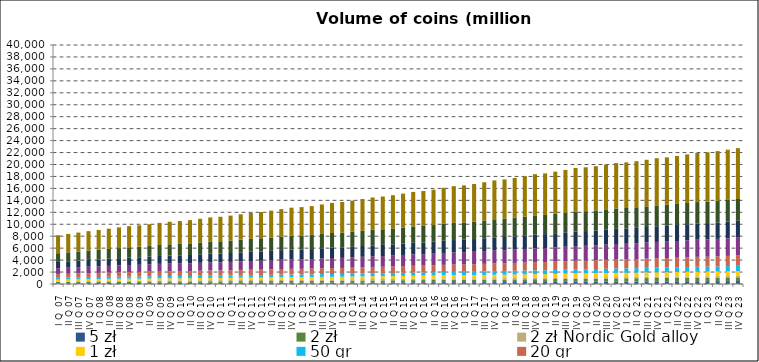
| Category | 5 zł | 2 zł | 2 zł Nordic Gold alloy | 1 zł | 50 gr | 20 gr | 10 gr | 5 gr | 2 gr | 1 gr |
|---|---|---|---|---|---|---|---|---|---|---|
| I Q  07 | 128.925 | 203.436 | 106.455 | 288.697 | 303.986 | 617.921 | 995.443 | 1054.495 | 1455.279 | 3008.076 |
| II Q 07 | 137.979 | 208.811 | 112.669 | 304.354 | 314.953 | 632.421 | 1017.821 | 1079.458 | 1491.694 | 3082.289 |
| III Q 07 | 144.925 | 218.512 | 117.189 | 314.387 | 327.785 | 644.381 | 1045.808 | 1106.071 | 1532.131 | 3157.015 |
| IV Q 07 | 152.966 | 222.148 | 124.747 | 320.172 | 334.976 | 668.63 | 1068.443 | 1138.454 | 1577.09 | 3233.525 |
| I Q 08 | 157.034 | 223.38 | 132.378 | 322.573 | 338.209 | 688.09 | 1090.962 | 1166.176 | 1619.841 | 3305.89 |
| II Q 08 | 162.349 | 231.933 | 137.587 | 333.21 | 342.406 | 707.859 | 1117.7 | 1197.903 | 1653.619 | 3374.339 |
| III Q 08 | 163.389 | 237.944 | 140.149 | 352.6 | 344.781 | 723.211 | 1146.852 | 1222.462 | 1679.878 | 3465.863 |
| IV Q 08 | 167.692 | 239.632 | 145.228 | 354.438 | 349.388 | 748.138 | 1170.047 | 1248.882 | 1724.192 | 3529.936 |
| I Q 09 | 173.376 | 238.946 | 148.941 | 345.802 | 354.387 | 760.651 | 1189.614 | 1266.928 | 1759.557 | 3580.576 |
| II Q 09 | 183.943 | 247.689 | 153.277 | 349.818 | 361.813 | 775.375 | 1211.241 | 1294.127 | 1793.901 | 3636.416 |
| III Q 09 | 193.254 | 255.113 | 159.526 | 352.836 | 371.531 | 795.289 | 1239.154 | 1325.485 | 1836.365 | 3700.936 |
| IV Q 09 | 193.912 | 253.541 | 165.782 | 351.473 | 372.198 | 806.961 | 1263.964 | 1358.406 | 1881.651 | 3769.924 |
| I Q 10 | 182.767 | 251.651 | 169.078 | 347.059 | 371.217 | 812.077 | 1281.063 | 1380.048 | 1915.753 | 3828.451 |
| II Q 10 | 185.525 | 256.719 | 173.377 | 351.98 | 374.793 | 821.085 | 1298.268 | 1398.335 | 1945.532 | 3884.836 |
| III Q 10 | 188.842 | 264.995 | 179.083 | 362.819 | 385.456 | 840.415 | 1326.115 | 1423.291 | 1984.831 | 3956.495 |
| IV Q 10 | 193.516 | 267.974 | 185.165 | 367.917 | 391.868 | 856.578 | 1354.582 | 1455.7 | 2032.021 | 4038.622 |
| I Q 11 | 191.459 | 264.781 | 188.57 | 362.559 | 390.659 | 862.285 | 1367.95 | 1468.96 | 2058.911 | 4095.575 |
| II Q 11 | 195.592 | 274.413 | 190.939 | 373.822 | 398.339 | 875.265 | 1391.669 | 1488.275 | 2093.662 | 4161.521 |
| III Q 11 | 196.53 | 280.852 | 198.093 | 383.193 | 409.038 | 894.127 | 1424.242 | 1516.243 | 2134.375 | 4231.885 |
| IV Q 11 | 200.335 | 282.076 | 203.984 | 386.198 | 415.495 | 907.751 | 1455.793 | 1546.269 | 2176.945 | 4334.419 |
| I Q 12 | 200.546 | 279.966 | 207.48 | 385.483 | 417.148 | 914.198 | 1475.656 | 1561.095 | 2205.9 | 4406.36 |
| II Q 12 | 205.869 | 287.613 | 211.679 | 396.374 | 427.04 | 927.83 | 1504.87 | 1585.087 | 2238.306 | 4490.048 |
| III Q 12 | 208.879 | 295.2 | 215.161 | 406.923 | 438.065 | 946.562 | 1538.924 | 1617.227 | 2280.753 | 4581.353 |
| IV Q 12 | 212.566 | 296.813 | 217.87 | 411.13 | 444.384 | 959.891 | 1568.443 | 1647.746 | 2323.575 | 4686.362 |
| I Q 13 | 213.063 | 294.389 | 220.743 | 408.499 | 444.055 | 962.746 | 1578.435 | 1656.492 | 2337.449 | 4749.773 |
| II Q 13 | 217.178 | 300.523 | 223.439 | 415.506 | 449.086 | 971.317 | 1599.532 | 1670.426 | 2368.486 | 4825.128 |
| III Q 13 | 222.036 | 308.946 | 226.131 | 429.643 | 461.435 | 989.474 | 1636.183 | 1698.648 | 2410.775 | 4926.225 |
| IV Q 13 | 229.505 | 311.774 | 230.296 | 435.098 | 468.399 | 1004.504 | 1670.697 | 1729.874 | 2455.202 | 5039.382 |
| I Q 14 | 232.24 | 311.623 | 232.286 | 432.489 | 468.693 | 1011.378 | 1684.791 | 1745.822 | 2481.781 | 5119.349 |
| II Q 14 | 242.402 | 321.521 | 234.94 | 443.67 | 477.189 | 1027.701 | 1711.629 | 1772.309 | 2518.693 | 5206.301 |
| III Q 14 | 248.403 | 329.786 | 235.973 | 457.954 | 490.528 | 1047.361 | 1746.557 | 1802.208 | 2555.805 | 5305.533 |
| IV Q 14 | 256.156 | 335.691 | 236.99 | 464.377 | 498.228 | 1064.886 | 1780.762 | 1835.565 | 2596.666 | 5411.291 |
| I Q 15 | 259.795 | 339.199 | 237.751 | 465.29 | 501.73 | 1076.038 | 1801.716 | 1858.024 | 2617.574 | 5487.856 |
| II Q 15 | 269.561 | 347.809 | 238.127 | 472.173 | 507.863 | 1089.703 | 1829.063 | 1882.038 | 2649.616 | 5570.77 |
| III Q 15 | 276.319 | 359.906 | 238.068 | 484.916 | 521.917 | 1112.486 | 1866.802 | 1910.586 | 2691.438 | 5668.586 |
| IV Q 15 | 287.191 | 366.776 | 238.395 | 491.303 | 531.108 | 1134.293 | 1902.082 | 1949.474 | 2737.229 | 5774.219 |
| I Q 16 | 294.192 | 369.006 | 238.61 | 491.608 | 534.269 | 1144.438 | 1921.446 | 1971.102 | 2760.234 | 5832.671 |
| II Q 16 | 304.708 | 378.074 | 238.83 | 501.236 | 542.469 | 1161.703 | 1950.395 | 1997.299 | 2793.418 | 5918.568 |
| III Q 16 | 307.171 | 391.82 | 239.079 | 517.008 | 558.453 | 1188.77 | 1993.787 | 2035.926 | 2838.051 | 6025.42 |
| IV Q 16 | 314.109 | 398.15 | 239.14 | 523.139 | 567.171 | 1210.091 | 2031.478 | 2073.818 | 2886.045 | 6134.696 |
| I Q 17 | 315.02 | 396.81 | 239.231 | 520.22 | 567.926 | 1219.441 | 2052.53 | 2093.323 | 2905.215 | 6196.261 |
| II Q 17 | 309.993 | 407.715 | 239.249 | 534.015 | 579.307 | 1238.966 | 2088.988 | 2122.103 | 2938.075 | 6283.488 |
| III Q 17 | 308.889 | 420.928 | 239.278 | 549.291 | 592.929 | 1262.511 | 2130.026 | 2156.115 | 2982.066 | 6389.334 |
| IV Q 17 | 314.474 | 428.391 | 239.267 | 559.553 | 604.371 | 1286.151 | 2170.29 | 2198.663 | 3031.34 | 6506.583 |
| I Q 18 | 319.046 | 430.374 | 239.252 | 560.732 | 608.532 | 1297.682 | 2193.416 | 2220.164 | 3059.788 | 6578.072 |
| II Q 18 | 329.901 | 442.987 | 239.239 | 576.505 | 620.494 | 1315.919 | 2224.435 | 2246.274 | 3089.841 | 6663.638 |
| III Q 18 | 334.237 | 455.729 | 239.17 | 593.359 | 635.826 | 1340.588 | 2268.012 | 2282.518 | 3135.208 | 6771.373 |
| IV Q 18 | 341.881 | 462.828 | 239.125 | 604.507 | 648.726 | 1364.466 | 2311.738 | 2325.022 | 3188.515 | 6895.9 |
| I Q 19 | 345.442 | 461.095 | 239.095 | 601.763 | 650.858 | 1373.241 | 2334.996 | 2341.851 | 3208.288 | 6959.509 |
| II Q 19 | 358.548 | 474.879 | 239.106 | 621.047 | 664.963 | 1392.1 | 2375.63 | 2375.481 | 3239.7 | 7061.23 |
| III Q 19 | 364.082 | 485.014 | 239.111 | 635.493 | 678.835 | 1413.236 | 2419.742 | 2411.099 | 3275.48 | 7170.917 |
| IV Q 19 | 373.126 | 494.375 | 239.095 | 649.039 | 692.514 | 1435.008 | 2466.395 | 2451.652 | 3319.038 | 7292.268 |
| I Q 20 | 377.249 | 495.484 | 239.058 | 649.067 | 697.46 | 1444.718 | 2490.679 | 2464.705 | 3329.683 | 7343.939 |
| II Q 20 | 386.996 | 510.138 | 239.054 | 663.223 | 707.112 | 1457.351 | 2516.581 | 2483.394 | 3346.22 | 7401.258 |
| III Q 20 | 396.597 | 521.097 | 239.025 | 676.534 | 721.048 | 1480.446 | 2558.517 | 2516.602 | 3378.328 | 7495.087 |
| IV Q 20 | 405.58 | 530.727 | 239.001 | 686.043 | 734.132 | 1501.394 | 2595.004 | 2547.8 | 3409.065 | 7588.717 |
| I Q 21 | 411.068 | 534.506 | 238.988 | 686.622 | 739.64 | 1511.953 | 2613.255 | 2560.543 | 3421.066 | 7639.865 |
| II Q 21 | 422.016 | 545.514 | 238.989 | 697.802 | 750.342 | 1528.042 | 2640.382 | 2580.153 | 3438.675 | 7708.049 |
| III Q 21 | 430.315 | 557.996 | 238.981 | 713.487 | 764.738 | 1551.155 | 2678.092 | 2604.938 | 3460.404 | 7787.601 |
| IV Q 21 | 438.749 | 565.282 | 238.98 | 723.141 | 777.453 | 1574.071 | 2717.358 | 2637.317 | 3490.741 | 7887.254 |
| I Q 22 | 442.683 | 567.923 | 238.979 | 722.905 | 784.732 | 1587.817 | 2743.238 | 2653.281 | 3508.544 | 7944.894 |
| II Q 22 | 451.667 | 577.97 | 238.964 | 731.655 | 798.681 | 1609.796 | 2781.321 | 2679.677 | 3532.465 | 8029.16 |
| III Q 22 | 458.214 | 592.07 | 238.94 | 747.689 | 815.85 | 1633.936 | 2826.283 | 2703.616 | 3555.716 | 8113.337 |
| IV Q 22 | 464.603 | 598.31 | 238.939 | 755.455 | 830.167 | 1657.44 | 2869.904 | 2722.977 | 3576.48 | 8204.527 |
| I Q 23 | 467.23 | 599.346 | 238.931 | 755.565 | 835.697 | 1667.785 | 2889.033 | 2743.369 | 3591.206 | 8255.328 |
| II Q 23 | 477.758 | 610.765 | 238.933 | 768.438 | 849.733 | 1684.979 | 2921.469 | 2762.687 | 3606.268 | 8325.731 |
| III Q 23 | 484.89 | 622.721 | 238.908 | 784.169 | 865.779 | 1705.047 | 2958.271 | 2788.993 | 3623.511 | 8403.872 |
| IV Q 23 | 493.292 | 630.243 | 238.902 | 794.723 | 880.309 | 1726.536 | 2997.739 | 2820.365 | 3648.018 | 8504.643 |